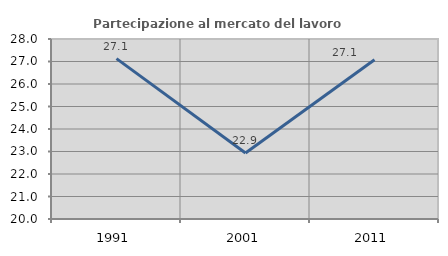
| Category | Partecipazione al mercato del lavoro  femminile |
|---|---|
| 1991.0 | 27.127 |
| 2001.0 | 22.931 |
| 2011.0 | 27.074 |